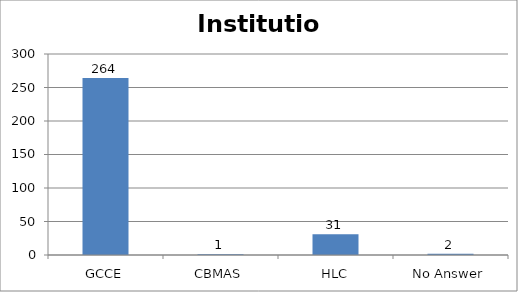
| Category | Institution |
|---|---|
| GCCE | 264 |
| CBMAS | 1 |
| HLC | 31 |
| No Answer | 2 |